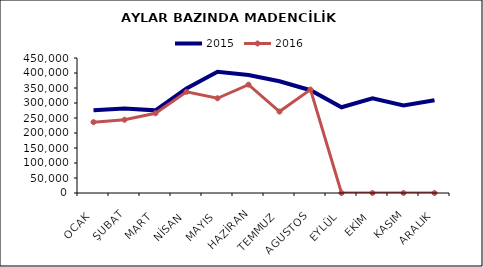
| Category | 2015 | 2016 |
|---|---|---|
| OCAK | 275911.1 | 236204.636 |
| ŞUBAT | 281267.109 | 244178.066 |
| MART | 275441.421 | 265659.72 |
| NİSAN | 348218.356 | 337256.002 |
| MAYIS | 403889.405 | 315766.939 |
| HAZİRAN | 393504.76 | 361177.881 |
| TEMMUZ | 372407.653 | 271405.364 |
| AGUSTOS | 342593.82 | 344754.381 |
| EYLÜL | 285769.358 | 0 |
| EKİM | 315506.201 | 0 |
| KASIM | 291654.31 | 0 |
| ARALIK | 309047.221 | 0 |